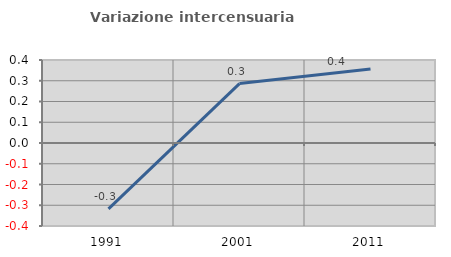
| Category | Variazione intercensuaria annua |
|---|---|
| 1991.0 | -0.318 |
| 2001.0 | 0.286 |
| 2011.0 | 0.357 |